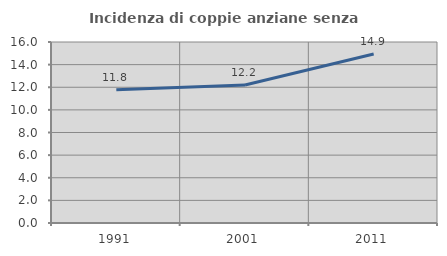
| Category | Incidenza di coppie anziane senza figli  |
|---|---|
| 1991.0 | 11.774 |
| 2001.0 | 12.195 |
| 2011.0 | 14.939 |